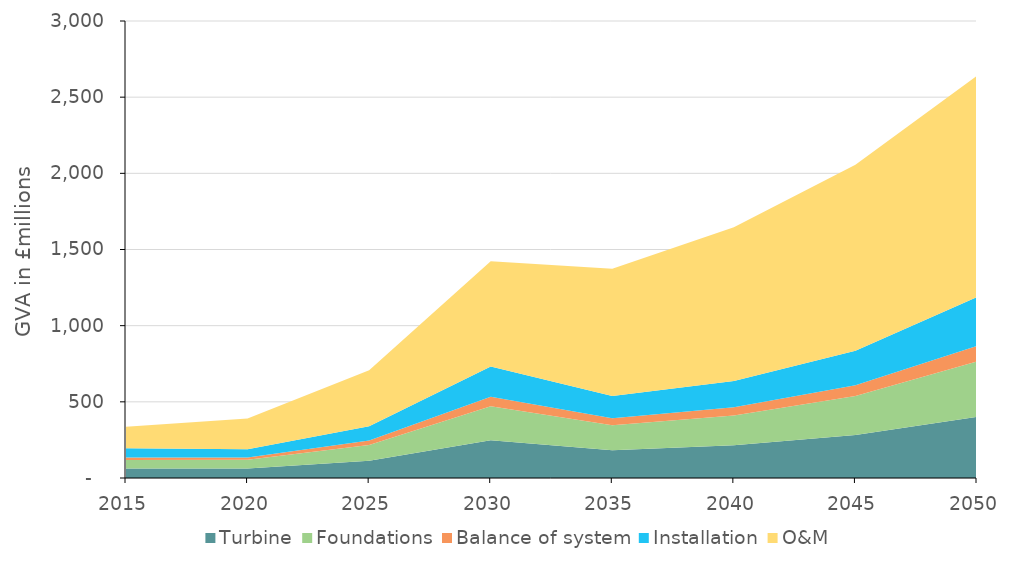
| Category | Turbine | Foundations | Balance of system | Installation | O&M  |
|---|---|---|---|---|---|
| 2015.0 | 62.355 | 56.509 | 15.735 | 61.274 | 140.249 |
| 2020.0 | 62.696 | 56.818 | 15.821 | 53.502 | 202.522 |
| 2025.0 | 113.732 | 103.07 | 28.7 | 93.775 | 367.258 |
| 2030.0 | 247.465 | 224.265 | 62.446 | 198.508 | 689.561 |
| 2035.0 | 181.997 | 164.935 | 45.926 | 145.993 | 835.575 |
| 2040.0 | 215.316 | 195.13 | 54.334 | 172.72 | 1008.772 |
| 2045.0 | 282.338 | 255.869 | 71.246 | 226.482 | 1219.763 |
| 2050.0 | 401.375 | 363.746 | 101.284 | 321.97 | 1452.396 |